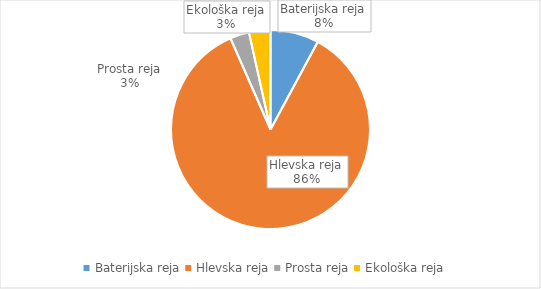
| Category | Količina kosov jajc |
|---|---|
| Baterijska reja | 260702 |
| Hlevska reja | 2835184 |
| Prosta reja | 103026 |
| Ekološka reja | 115300 |